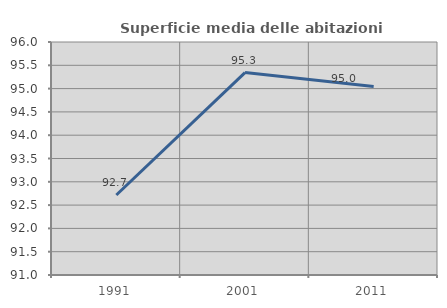
| Category | Superficie media delle abitazioni occupate |
|---|---|
| 1991.0 | 92.716 |
| 2001.0 | 95.344 |
| 2011.0 | 95.046 |